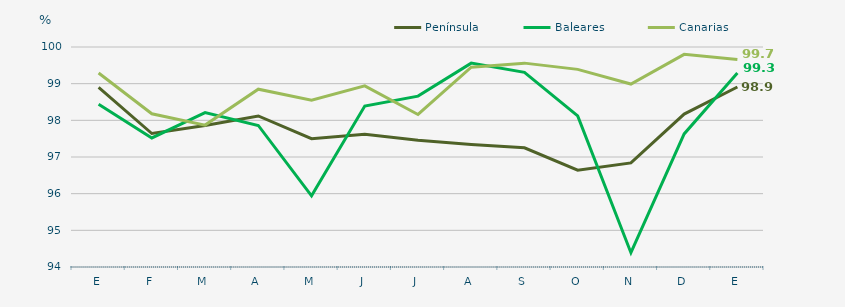
| Category | Península | Baleares | Canarias |
|---|---|---|---|
| E | 98.9 | 98.44 | 99.29 |
| F | 97.64 | 97.52 | 98.18 |
| M | 97.86 | 98.21 | 97.87 |
| A | 98.12 | 97.86 | 98.85 |
| M | 97.5 | 95.94 | 98.55 |
| J | 97.62 | 98.39 | 98.94 |
| J | 97.46 | 98.66 | 98.16 |
| A | 97.34 | 99.56 | 99.45 |
| S | 97.25 | 99.31 | 99.56 |
| O | 96.64 | 98.12 | 99.39 |
| N | 96.84 | 94.39 | 98.99 |
| D | 98.17 | 97.63 | 99.8 |
| E | 98.91 | 99.29 | 99.66 |